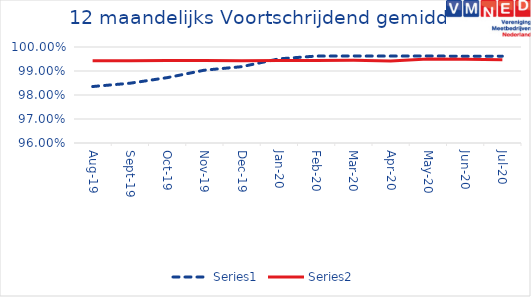
| Category | Series 0 | Series 1 |
|---|---|---|
| 2019-08-01 | 0.984 | 0.994 |
| 2019-09-01 | 0.985 | 0.994 |
| 2019-10-01 | 0.987 | 0.994 |
| 2019-11-01 | 0.99 | 0.994 |
| 2019-12-01 | 0.992 | 0.994 |
| 2020-01-01 | 0.995 | 0.994 |
| 2020-02-01 | 0.996 | 0.994 |
| 2020-03-01 | 0.996 | 0.994 |
| 2020-04-01 | 0.996 | 0.994 |
| 2020-05-01 | 0.996 | 0.995 |
| 2020-06-01 | 0.996 | 0.995 |
| 2020-07-01 | 0.996 | 0.995 |